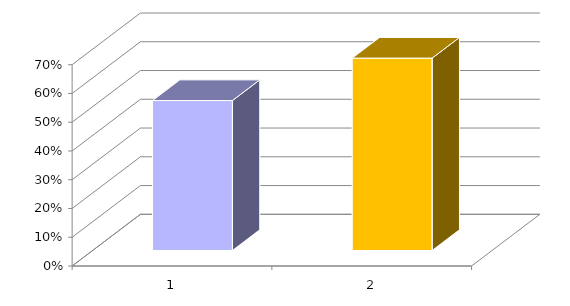
| Category | Series 0 |
|---|---|
| 0 | 0.521 |
| 1 | 0.669 |